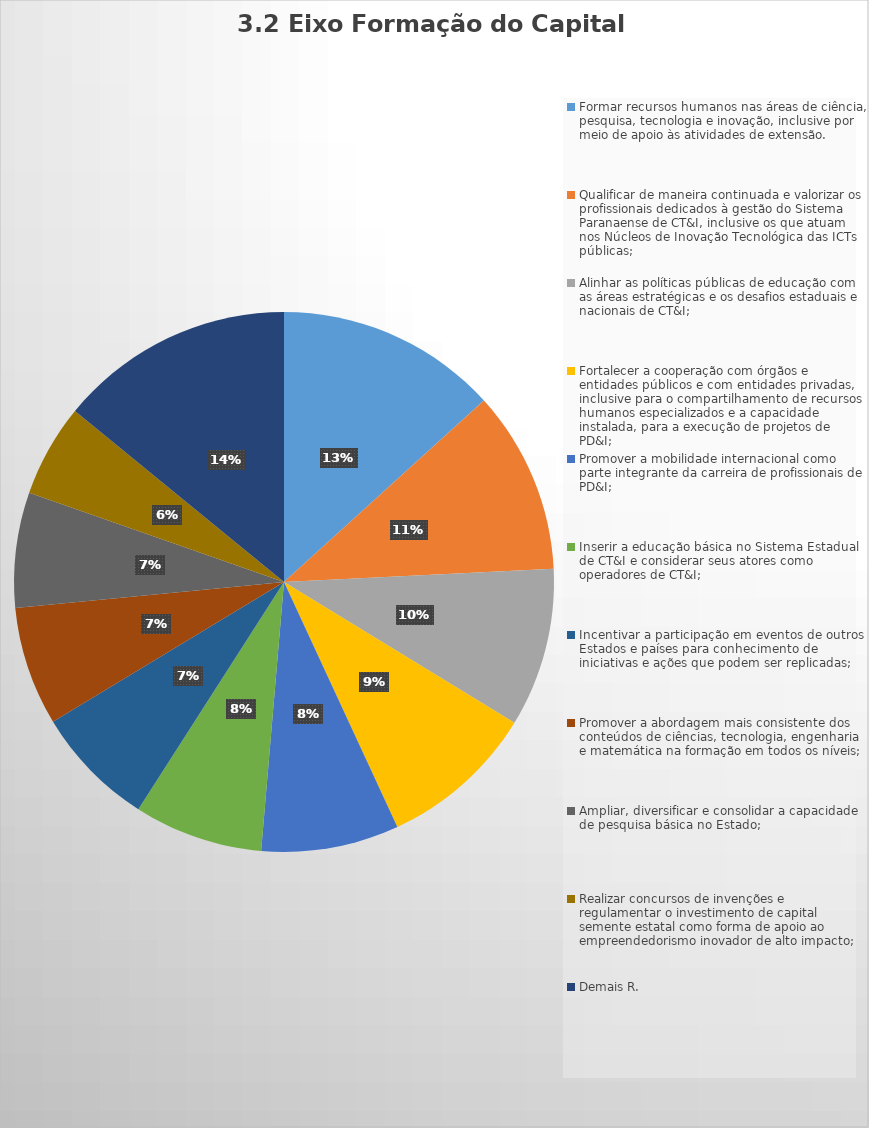
| Category | Series 0 |
|---|---|
| Formar recursos humanos nas áreas de ciência, pesquisa, tecnologia e inovação, inclusive por meio de apoio às atividades de extensão. | 177 |
| Qualificar de maneira continuada e valorizar os profissionais dedicados à gestão do Sistema Paranaense de CT&I, inclusive os que atuam nos Núcleos de Inovação Tecnológica das ICTs públicas; | 146 |
| Alinhar as políticas públicas de educação com as áreas estratégicas e os desafios estaduais e nacionais de CT&I; | 127 |
| Fortalecer a cooperação com órgãos e entidades públicos e com entidades privadas, inclusive para o compartilhamento de recursos humanos especializados e a capacidade instalada, para a execução de projetos de PD&I; | 125 |
| Promover a mobilidade internacional como parte integrante da carreira de profissionais de PD&I; | 110 |
| Inserir a educação básica no Sistema Estadual de CT&I e considerar seus atores como operadores de CT&I; | 103 |
| Incentivar a participação em eventos de outros Estados e países para conhecimento de iniciativas e ações que podem ser replicadas; | 97 |
| Promover a abordagem mais consistente dos conteúdos de ciências, tecnologia, engenharia e matemática na formação em todos os níveis; | 95 |
| Ampliar, diversificar e consolidar a capacidade de pesquisa básica no Estado; | 92 |
| Realizar concursos de invenções e regulamentar o investimento de capital semente estatal como forma de apoio ao empreendedorismo inovador de alto impacto; | 74 |
| Demais R. | 188 |